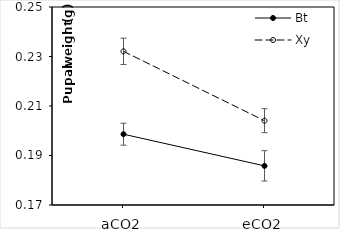
| Category | Bt | Xy |
|---|---|---|
| aCO2 | 0.199 | 0.232 |
| eCO2 | 0.186 | 0.204 |